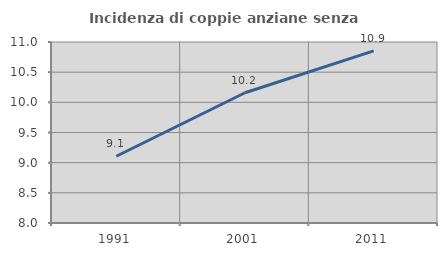
| Category | Incidenza di coppie anziane senza figli  |
|---|---|
| 1991.0 | 9.107 |
| 2001.0 | 10.159 |
| 2011.0 | 10.854 |